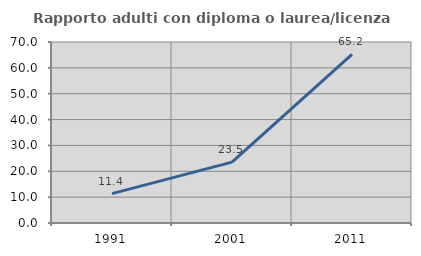
| Category | Rapporto adulti con diploma o laurea/licenza media  |
|---|---|
| 1991.0 | 11.364 |
| 2001.0 | 23.529 |
| 2011.0 | 65.217 |